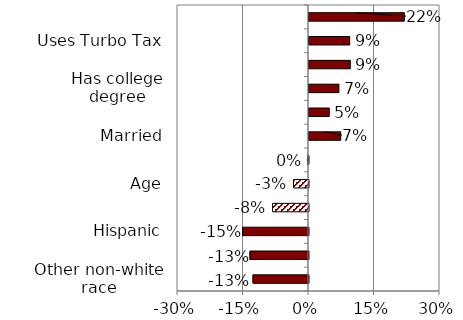
| Category | Series 0 |
|---|---|
| Other non-white race | -0.127 |
| Black | -0.134 |
| Hispanic | -0.151 |
| Asian | -0.082 |
| Age | -0.034 |
| Female | -0.002 |
| Married | 0.073 |
| Income | 0.046 |
| Has college degree | 0.069 |
| Lives in metropolitan area | 0.095 |
| Uses Turbo Tax | 0.093 |
| Uses online banking | 0.218 |